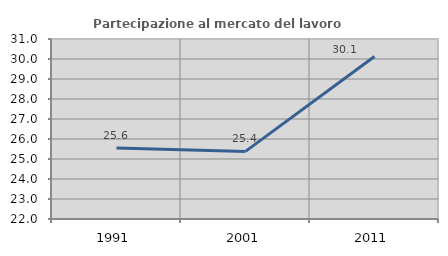
| Category | Partecipazione al mercato del lavoro  femminile |
|---|---|
| 1991.0 | 25.551 |
| 2001.0 | 25.381 |
| 2011.0 | 30.128 |